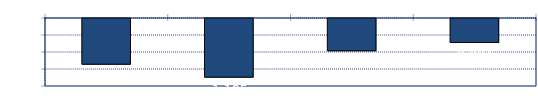
| Category | Series 0 |
|---|---|
| 0 | -1.119 |
| 1 | -1.195 |
| 2 | -1.04 |
| 3 | -0.991 |